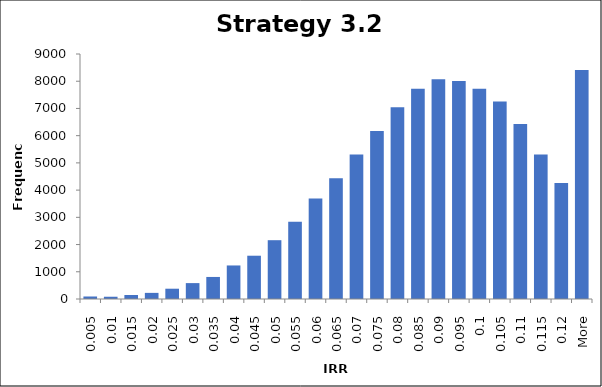
| Category | Frequency |
|---|---|
| 0.005 | 92 |
| 0.01 | 83 |
| 0.015 | 146 |
| 0.02 | 225 |
| 0.025 | 378 |
| 0.03 | 584 |
| 0.035 | 810 |
| 0.04 | 1232 |
| 0.045 | 1590 |
| 0.05 | 2160 |
| 0.055 | 2841 |
| 0.06 | 3694 |
| 0.065 | 4440 |
| 0.07 | 5309 |
| 0.075 | 6176 |
| 0.08 | 7046 |
| 0.085 | 7724 |
| 0.09 | 8076 |
| 0.095 | 8008 |
| 0.1 | 7726 |
| 0.105 | 7252 |
| 0.11 | 6431 |
| 0.115 | 5310 |
| 0.12 | 4261 |
| More | 8408 |